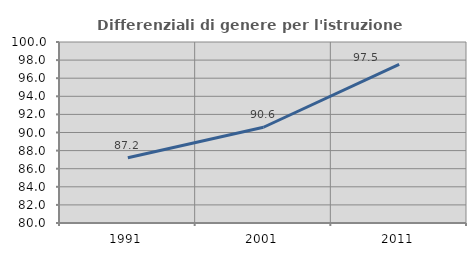
| Category | Differenziali di genere per l'istruzione superiore |
|---|---|
| 1991.0 | 87.217 |
| 2001.0 | 90.581 |
| 2011.0 | 97.516 |